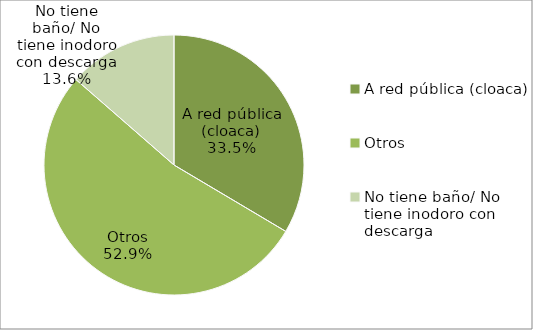
| Category | Series 0 |
|---|---|
| A red pública (cloaca) | 33.529 |
| Otros | 52.88 |
| No tiene baño/ No tiene inodoro con descarga | 13.591 |